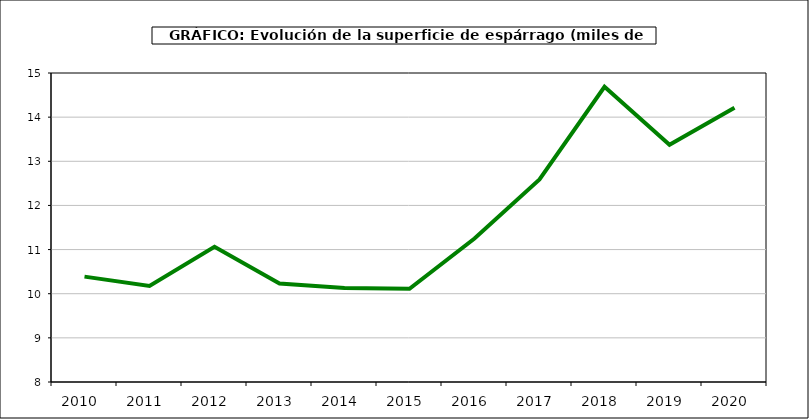
| Category | superficie |
|---|---|
| 2010.0 | 10.387 |
| 2011.0 | 10.178 |
| 2012.0 | 11.065 |
| 2013.0 | 10.231 |
| 2014.0 | 10.132 |
| 2015.0 | 10.112 |
| 2016.0 | 11.251 |
| 2017.0 | 12.589 |
| 2018.0 | 14.688 |
| 2019.0 | 13.373 |
| 2020.0 | 14.215 |